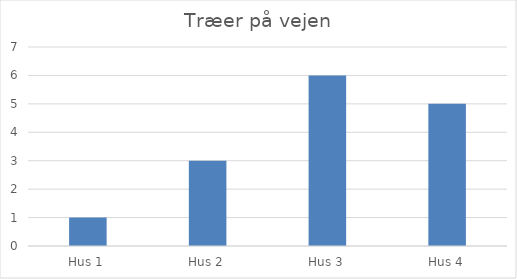
| Category | Series 0 |
|---|---|
| Hus 1 | 1 |
| Hus 2 | 3 |
| Hus 3 | 6 |
| Hus 4 | 5 |